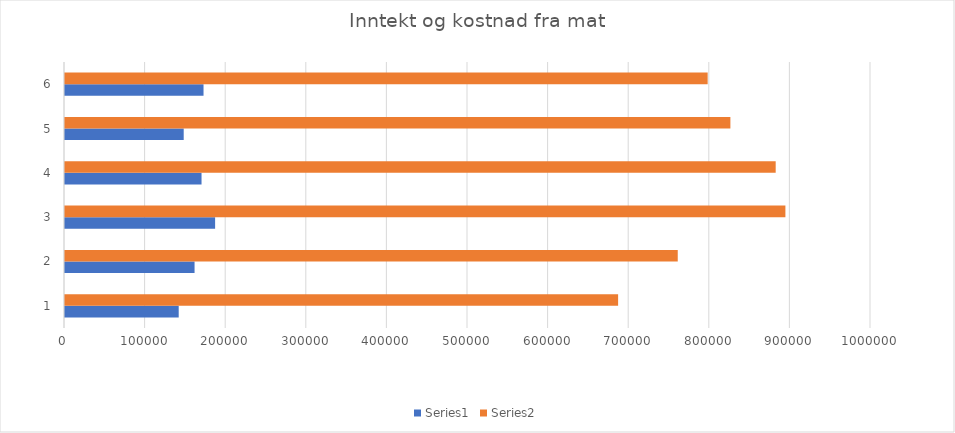
| Category | Series 0 | Series 1 |
|---|---|---|
| 0 | 141075 | 686240.38 |
| 1 | 160746 | 760233.3 |
| 2 | 186244 | 893798.85 |
| 3 | 169399 | 881749.6 |
| 4 | 147271 | 825543.34 |
| 5 | 171866.68 | 797353.25 |